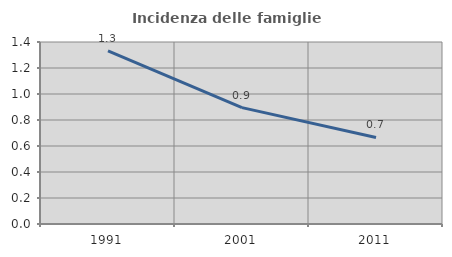
| Category | Incidenza delle famiglie numerose |
|---|---|
| 1991.0 | 1.331 |
| 2001.0 | 0.895 |
| 2011.0 | 0.665 |